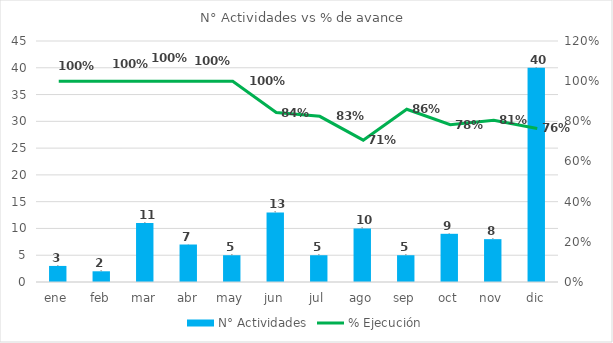
| Category | N° Actividades |
|---|---|
| ene | 3 |
| feb | 2 |
| mar | 11 |
| abr | 7 |
| may | 5 |
| jun | 13 |
| jul | 5 |
| ago | 10 |
| sep | 5 |
| oct | 9 |
| nov | 8 |
| dic | 40 |